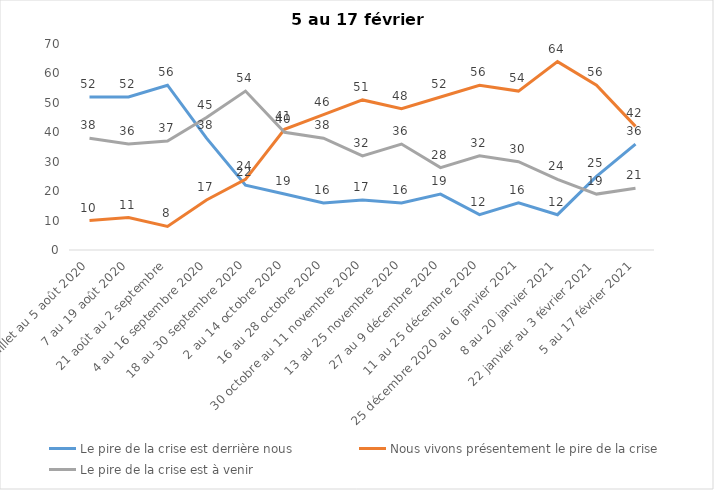
| Category | Le pire de la crise est derrière nous | Nous vivons présentement le pire de la crise | Le pire de la crise est à venir |
|---|---|---|---|
| 24 juillet au 5 août 2020 | 52 | 10 | 38 |
| 7 au 19 août 2020 | 52 | 11 | 36 |
| 21 août au 2 septembre | 56 | 8 | 37 |
| 4 au 16 septembre 2020 | 38 | 17 | 45 |
| 18 au 30 septembre 2020 | 22 | 24 | 54 |
| 2 au 14 octobre 2020 | 19 | 41 | 40 |
| 16 au 28 octobre 2020 | 16 | 46 | 38 |
| 30 octobre au 11 novembre 2020 | 17 | 51 | 32 |
| 13 au 25 novembre 2020 | 16 | 48 | 36 |
| 27 au 9 décembre 2020 | 19 | 52 | 28 |
| 11 au 25 décembre 2020 | 12 | 56 | 32 |
| 25 décembre 2020 au 6 janvier 2021 | 16 | 54 | 30 |
| 8 au 20 janvier 2021 | 12 | 64 | 24 |
| 22 janvier au 3 février 2021 | 25 | 56 | 19 |
| 5 au 17 février 2021 | 36 | 42 | 21 |